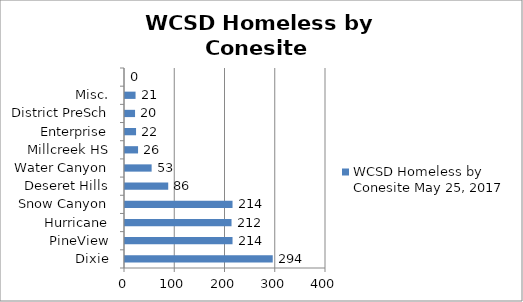
| Category | WCSD Homeless by Conesite May 25, 2017 |
|---|---|
| Dixie | 294 |
| PineView | 214 |
| Hurricane | 212 |
| Snow Canyon | 214 |
| Deseret Hills | 86 |
| Water Canyon | 53 |
| Millcreek HS | 26 |
| Enterprise | 22 |
| District PreSch | 20 |
| Misc. | 21 |